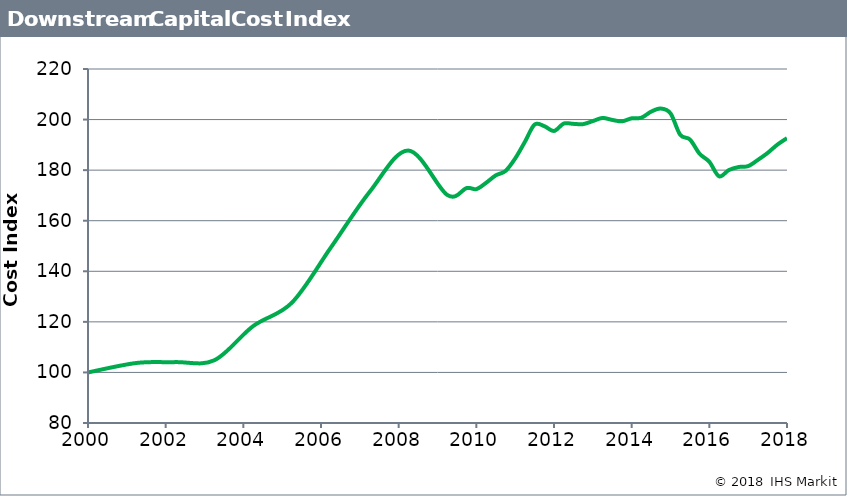
| Category | Series 1 |
|---|---|
| 2000.0 | 100 |
| 2001.25 | 103.742 |
| 2002.25 | 104.08 |
| 2003.25 | 104.788 |
| 2004.25 | 118.291 |
| 2005.25 | 127.578 |
| 2006.25 | 149.32 |
| 2007.25 | 171.348 |
| 2008.25 | 187.749 |
| 2009.25 | 170.2 |
| 2009.75 | 172.9 |
| 2010.0 | 172.5 |
| 2010.25 | 174.98 |
| 2010.5 | 177.93 |
| 2010.75 | 179.66 |
| 2011.0 | 184.61 |
| 2011.25 | 191.18 |
| 2011.5 | 198.02 |
| 2011.75 | 197.4 |
| 2012.0 | 195.48 |
| 2012.25 | 198.42 |
| 2012.5 | 198.3 |
| 2012.75 | 198.2 |
| 2013.0 | 199.4 |
| 2013.25 | 200.64 |
| 2013.5 | 199.86 |
| 2013.75 | 199.31 |
| 2014.0 | 200.49 |
| 2014.25 | 200.73 |
| 2014.5 | 203.13 |
| 2014.75 | 204.36 |
| 2015.0 | 202.46 |
| 2015.25 | 193.99 |
| 2015.5 | 192.12 |
| 2015.75 | 186.47 |
| 2016.0 | 183.303 |
| 2016.25 | 177.565 |
| 2016.5 | 180.012 |
| 2016.75 | 181.227 |
| 2017.0 | 181.593 |
| 2017.25 | 184.054 |
| 2017.5 | 186.793 |
| 2017.75 | 190.057 |
| 2018.0 | 192.653 |